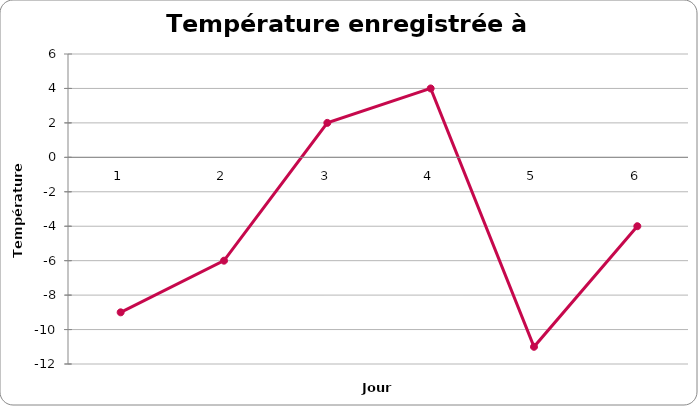
| Category | Température enregistrée à midi |
|---|---|
| 1.0 | -9 |
| 2.0 | -6 |
| 3.0 | 2 |
| 4.0 | 4 |
| 5.0 | -11 |
| 6.0 | -4 |